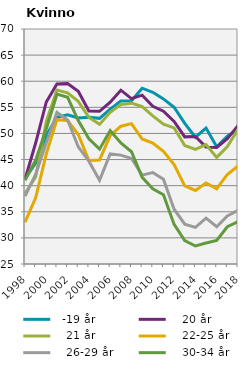
| Category |   -19 år |    20 år |    21 år |    22-25 år |    26-29 år |    30-34 år |
|---|---|---|---|---|---|---|
| 1998.0 | 41.356 | 41.175 | 38.531 | 33.015 | 37.995 | 41.052 |
| 1999.0 | 44.314 | 48.163 | 41.658 | 37.66 | 42.14 | 44.879 |
| 2000.0 | 49.607 | 56.029 | 52.325 | 46.102 | 48.2 | 50.9 |
| 2001.0 | 53.082 | 59.467 | 58.309 | 52.64 | 54.026 | 57.518 |
| 2002.0 | 53.576 | 59.539 | 57.791 | 52.48 | 52.573 | 56.914 |
| 2003.0 | 52.965 | 58.084 | 56.138 | 49.803 | 47.461 | 52.47 |
| 2004.0 | 53.113 | 54.308 | 53.093 | 44.811 | 44.682 | 48.989 |
| 2005.0 | 52.896 | 54.231 | 51.738 | 44.924 | 41.029 | 46.986 |
| 2006.0 | 54.66 | 55.993 | 54.063 | 49.559 | 46.079 | 50.564 |
| 2007.0 | 56.231 | 58.282 | 55.522 | 51.379 | 45.85 | 48.188 |
| 2008.0 | 56.263 | 56.659 | 55.802 | 51.877 | 45.196 | 46.493 |
| 2009.0 | 58.671 | 57.335 | 55.155 | 48.933 | 42.018 | 41.6 |
| 2010.0 | 57.882 | 55.202 | 53.368 | 48.152 | 42.522 | 39.405 |
| 2011.0 | 56.62 | 54.272 | 51.792 | 46.569 | 41.209 | 38.258 |
| 2012.0 | 55.007 | 52.298 | 51.067 | 44.022 | 35.493 | 32.578 |
| 2013.0 | 51.925 | 49.345 | 47.703 | 39.974 | 32.637 | 29.498 |
| 2014.0 | 49.276 | 49.427 | 46.948 | 39.078 | 32.018 | 28.445 |
| 2015.0 | 51.033 | 47.406 | 47.876 | 40.525 | 33.788 | 29.021 |
| 2016.0 | 47.446 | 47.304 | 45.408 | 39.407 | 32.144 | 29.503 |
| 2017.0 | 49.492 | 49.001 | 47.482 | 42.147 | 34.218 | 32.134 |
| 2018.0 | 50.768 | 51.478 | 50.795 | 43.779 | 35.271 | 33.11 |